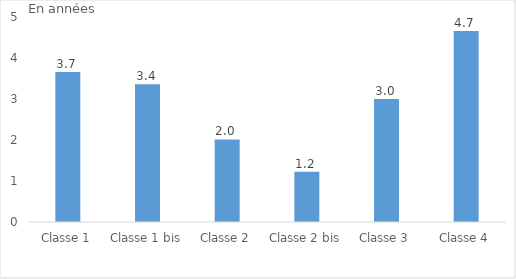
| Category | Series 0 |
|---|---|
| Classe 1 | 3.66 |
| Classe 1 bis | 3.359 |
| Classe 2 | 2.015 |
| Classe 2 bis | 1.227 |
| Classe 3 | 3 |
| Classe 4 | 4.657 |